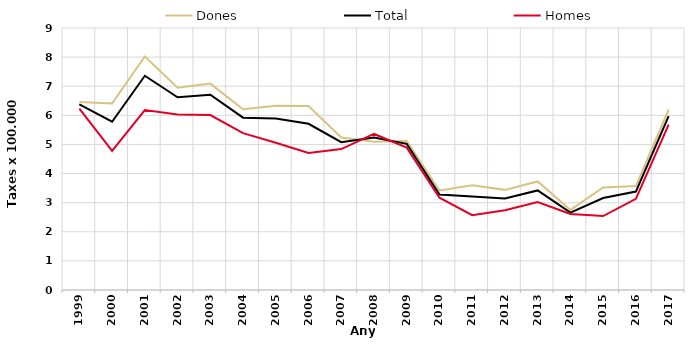
| Category | Dones | Total | Homes |
|---|---|---|---|
| 1999.0 | 6.46 | 6.38 | 6.23 |
| 2000.0 | 6.41 | 5.78 | 4.78 |
| 2001.0 | 8.02 | 7.36 | 6.18 |
| 2002.0 | 6.95 | 6.62 | 6.03 |
| 2003.0 | 7.09 | 6.71 | 6.01 |
| 2004.0 | 6.21 | 5.92 | 5.39 |
| 2005.0 | 6.33 | 5.89 | 5.06 |
| 2006.0 | 6.32 | 5.71 | 4.71 |
| 2007.0 | 5.24 | 5.08 | 4.84 |
| 2008.0 | 5.09 | 5.24 | 5.36 |
| 2009.0 | 5.12 | 5.02 | 4.89 |
| 2010.0 | 3.42 | 3.28 | 3.17 |
| 2011.0 | 3.6 | 3.21 | 2.57 |
| 2012.0 | 3.44 | 3.14 | 2.74 |
| 2013.0 | 3.73 | 3.42 | 3.02 |
| 2014.0 | 2.75 | 2.66 | 2.61 |
| 2015.0 | 3.52 | 3.16 | 2.54 |
| 2016.0 | 3.57 | 3.38 | 3.13 |
| 2017.0 | 6.2 | 5.97 | 5.68 |